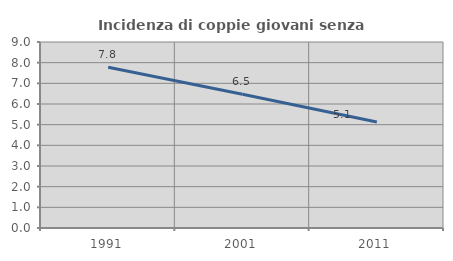
| Category | Incidenza di coppie giovani senza figli |
|---|---|
| 1991.0 | 7.777 |
| 2001.0 | 6.474 |
| 2011.0 | 5.13 |